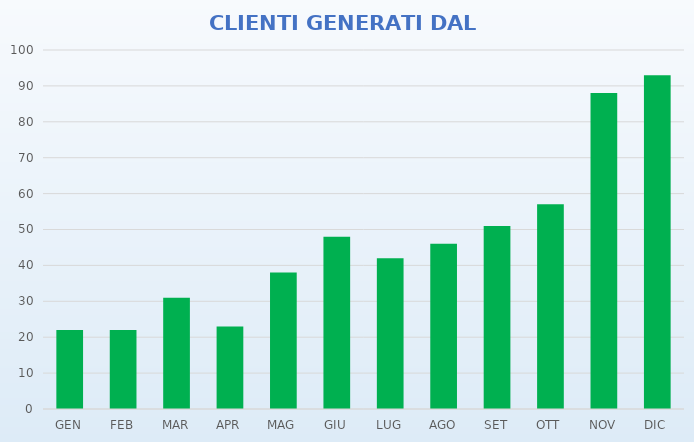
| Category | TOTALI |
|---|---|
| GEN | 22 |
| FEB | 22 |
| MAR | 31 |
| APR | 23 |
| MAG | 38 |
| GIU | 48 |
| LUG | 42 |
| AGO | 46 |
| SET | 51 |
| OTT | 57 |
| NOV | 88 |
| DIC | 93 |